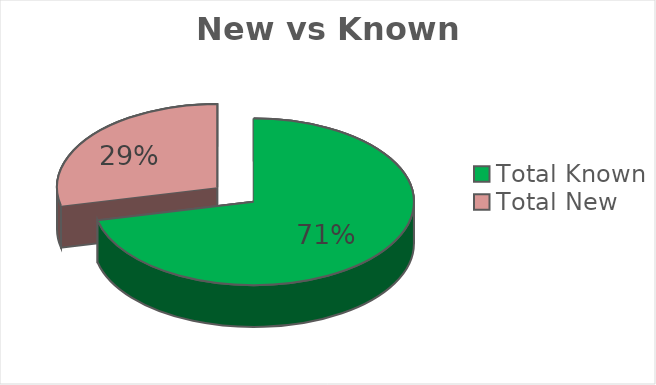
| Category | Series 0 |
|---|---|
| Total Known | 10 |
| Total New | 4 |